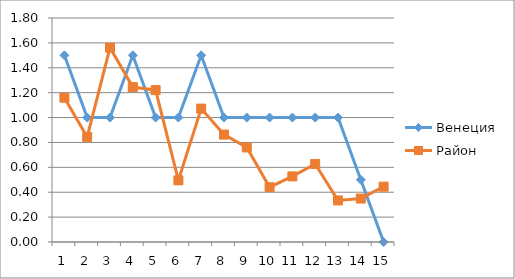
| Category | Венеция | Район |
|---|---|---|
| 0 | 1.5 | 1.16 |
| 1 | 1 | 0.844 |
| 2 | 1 | 1.562 |
| 3 | 1.5 | 1.245 |
| 4 | 1 | 1.22 |
| 5 | 1 | 0.496 |
| 6 | 1.5 | 1.072 |
| 7 | 1 | 0.863 |
| 8 | 1 | 0.76 |
| 9 | 1 | 0.44 |
| 10 | 1 | 0.527 |
| 11 | 1 | 0.627 |
| 12 | 1 | 0.334 |
| 13 | 0.5 | 0.349 |
| 14 | 0 | 0.445 |